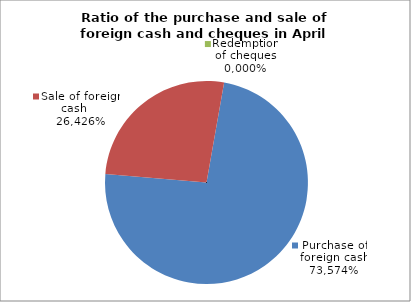
| Category | Purchase of foreign cash |
|---|---|
| 0 | 0.736 |
| 1 | 0.264 |
| 2 | 0 |